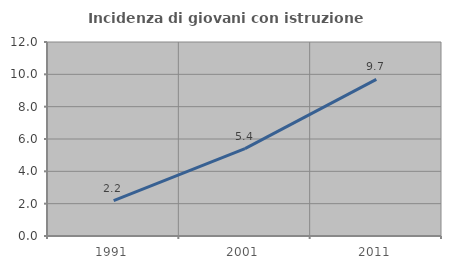
| Category | Incidenza di giovani con istruzione universitaria |
|---|---|
| 1991.0 | 2.185 |
| 2001.0 | 5.409 |
| 2011.0 | 9.686 |